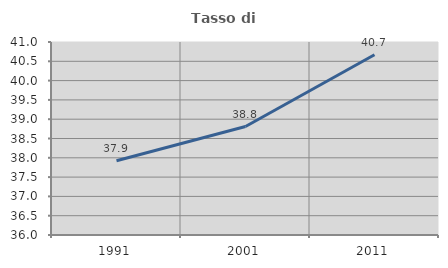
| Category | Tasso di occupazione   |
|---|---|
| 1991.0 | 37.922 |
| 2001.0 | 38.81 |
| 2011.0 | 40.669 |